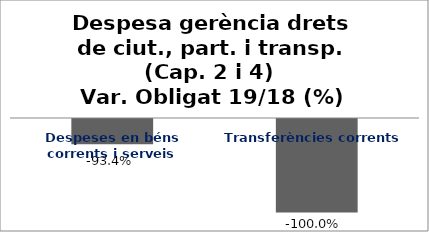
| Category | Series 0 |
|---|---|
| Despeses en béns corrents i serveis | -0.934 |
| Transferències corrents | -1 |